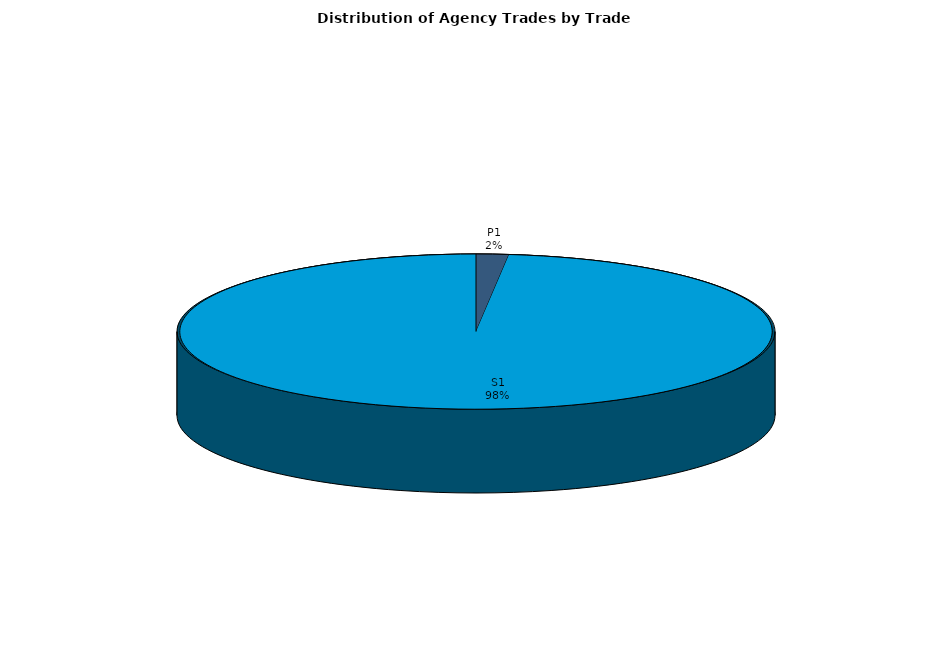
| Category | Series 0 |
|---|---|
| P1 | 37.671 |
| S1 | 2101.516 |